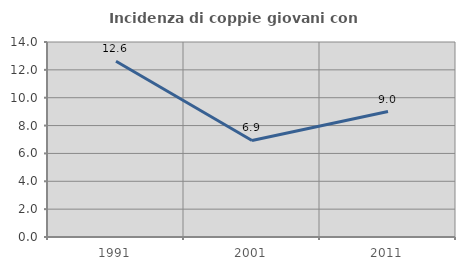
| Category | Incidenza di coppie giovani con figli |
|---|---|
| 1991.0 | 12.621 |
| 2001.0 | 6.931 |
| 2011.0 | 9.009 |